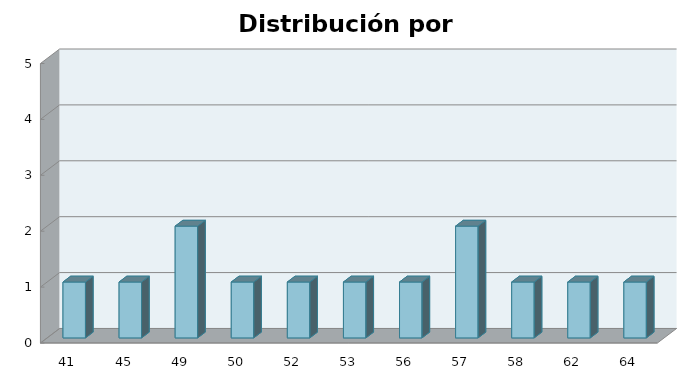
| Category | Series 1 |
|---|---|
| 41.0 | 1 |
| 45.0 | 1 |
| 49.0 | 2 |
| 50.0 | 1 |
| 52.0 | 1 |
| 53.0 | 1 |
| 56.0 | 1 |
| 57.0 | 2 |
| 58.0 | 1 |
| 62.0 | 1 |
| 64.0 | 1 |